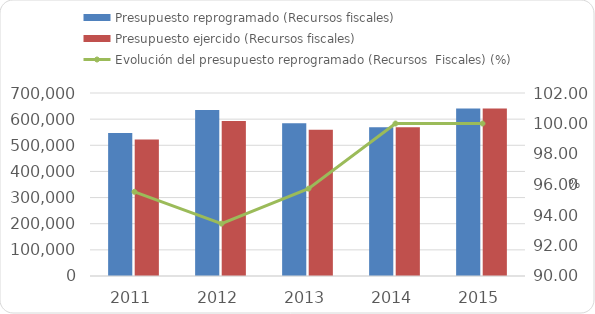
| Category | Presupuesto reprogramado (Recursos fiscales) | Presupuesto ejercido (Recursos fiscales)  |
|---|---|---|
| 2011 | 546914 | 522410 |
| 2012 | 634664.6 | 592994.5 |
| 2013 | 584645.8 | 559675.9 |
| 2014 | 569365.9 | 569354.2 |
| 2015 | 640885.41 | 640885.402 |